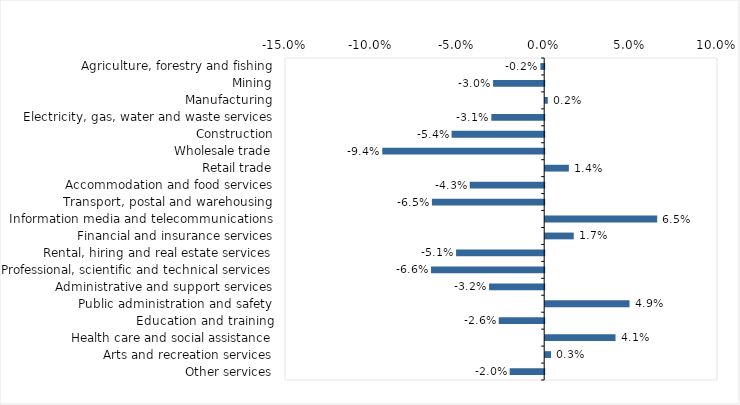
| Category | This week |
|---|---|
| Agriculture, forestry and fishing | -0.002 |
| Mining | -0.03 |
| Manufacturing | 0.002 |
| Electricity, gas, water and waste services | -0.031 |
| Construction | -0.054 |
| Wholesale trade | -0.094 |
| Retail trade | 0.014 |
| Accommodation and food services | -0.043 |
| Transport, postal and warehousing | -0.065 |
| Information media and telecommunications | 0.065 |
| Financial and insurance services | 0.016 |
| Rental, hiring and real estate services | -0.051 |
| Professional, scientific and technical services | -0.066 |
| Administrative and support services | -0.032 |
| Public administration and safety | 0.049 |
| Education and training | -0.026 |
| Health care and social assistance | 0.041 |
| Arts and recreation services | 0.003 |
| Other services | -0.02 |